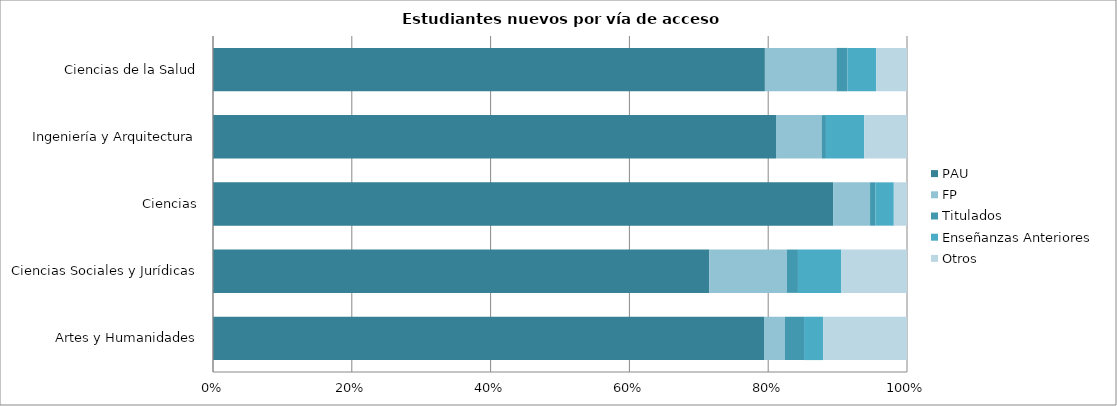
| Category | PAU | FP | Titulados | Enseñanzas Anteriores  | Otros |
|---|---|---|---|---|---|
| Artes y Humanidades | 289 | 11 | 10 | 10 | 44 |
| Ciencias Sociales y Jurídicas | 1702 | 266 | 38 | 149 | 225 |
| Ciencias | 235 | 14 | 2 | 7 | 5 |
| Ingeniería y Arquitectura | 778 | 63 | 6 | 53 | 59 |
| Ciencias de la Salud | 501 | 65 | 10 | 26 | 28 |